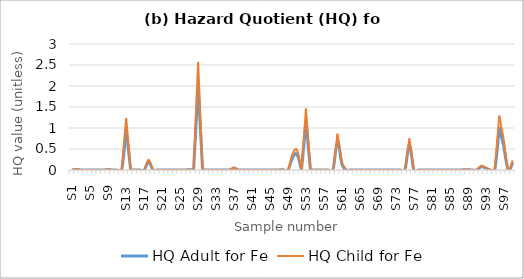
| Category | HQ Adult for Fe | HQ Child for Fe |
|---|---|---|
| S1 | 0.001 | 0.002 |
| S2 | 0.014 | 0.018 |
| S3 | 0 | 0 |
| S4 | 0 | 0 |
| S5 | 0 | 0 |
| S6 | 0 | 0 |
| S7 | 0 | 0 |
| S8 | 0 | 0 |
| S9 | 0.01 | 0.012 |
| S10 | 0 | 0 |
| S11 | 0 | 0 |
| S12 | 0 | 0 |
| S13 | 0.97 | 1.235 |
| S14 | 0 | 0 |
| S15 | 0 | 0 |
| S16 | 0 | 0.001 |
| S17 | 0 | 0 |
| S18 | 0.193 | 0.246 |
| S19 | 0 | 0.001 |
| S20 | 0 | 0.001 |
| S21 | 0.001 | 0.001 |
| S22 | 0 | 0.001 |
| S23 | 0 | 0 |
| S24 | 0 | 0 |
| S25 | 0 | 0 |
| S26 | 0 | 0 |
| S27 | 0.006 | 0.008 |
| S28 | 0 | 0 |
| S29 | 2.021 | 2.573 |
| S30 | 0 | 0 |
| S31 | 0 | 0 |
| S32 | 0 | 0.001 |
| S33 | 0 | 0.001 |
| S34 | 0 | 0 |
| S35 | 0 | 0 |
| S36 | 0.001 | 0.001 |
| S37 | 0.044 | 0.056 |
| S38 | 0 | 0.001 |
| S39 | 0 | 0 |
| S40 | 0 | 0 |
| S41 | 0.001 | 0.001 |
| S42 | 0.001 | 0.001 |
| S43 | 0 | 0 |
| S44 | 0 | 0.001 |
| S45 | 0.001 | 0.001 |
| S46 | 0 | 0 |
| S47 | 0.003 | 0.003 |
| S48 | 0.003 | 0.004 |
| S49 | 0.001 | 0.002 |
| S50 | 0.295 | 0.376 |
| S51 | 0.375 | 0.478 |
| S52 | 0 | 0 |
| S53 | 1.149 | 1.462 |
| S54 | 0 | 0 |
| S55 | 0 | 0 |
| S56 | 0 | 0 |
| S57 | 0 | 0 |
| S58 | 0 | 0 |
| S59 | 0.001 | 0.001 |
| S60 | 0.678 | 0.863 |
| S61 | 0.138 | 0.176 |
| S62 | 0 | 0 |
| S63 | 0 | 0 |
| S64 | 0 | 0 |
| S65 | 0 | 0 |
| S66 | 0 | 0 |
| S67 | 0 | 0 |
| S68 | 0 | 0 |
| S69 | 0 | 0 |
| S70 | 0 | 0 |
| S71 | 0 | 0 |
| S72 | 0 | 0 |
| S73 | 0 | 0 |
| S74 | 0 | 0 |
| S75 | 0 | 0 |
| S76 | 0.59 | 0.751 |
| S77 | 0 | 0 |
| S78 | 0 | 0 |
| S79 | 0 | 0 |
| S80 | 0 | 0 |
| S81 | 0 | 0 |
| S82 | 0 | 0 |
| S83 | 0.001 | 0.001 |
| S84 | 0 | 0 |
| S85 | 0.001 | 0.001 |
| S86 | 0.001 | 0.002 |
| S87 | 0.001 | 0.001 |
| S88 | 0.004 | 0.005 |
| S89 | 0.005 | 0.006 |
| S90 | 0.001 | 0.001 |
| S91 | 0 | 0 |
| S92 | 0.079 | 0.101 |
| S93 | 0.046 | 0.058 |
| S94 | 0.001 | 0.001 |
| S95 | 0.005 | 0.006 |
| S96 | 1.016 | 1.293 |
| S97 | 0.564 | 0.718 |
| S98 | 0.001 | 0.001 |
| S99 | 0.18 | 0.23 |